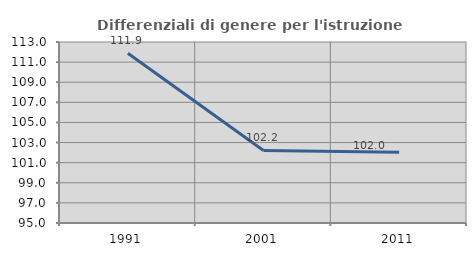
| Category | Differenziali di genere per l'istruzione superiore |
|---|---|
| 1991.0 | 111.888 |
| 2001.0 | 102.213 |
| 2011.0 | 102.024 |